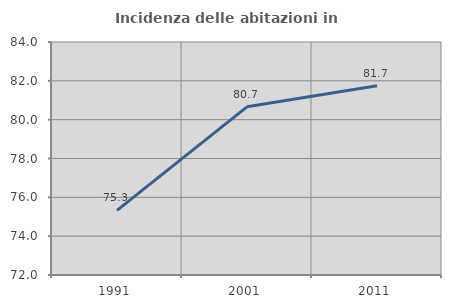
| Category | Incidenza delle abitazioni in proprietà  |
|---|---|
| 1991.0 | 75.33 |
| 2001.0 | 80.662 |
| 2011.0 | 81.748 |